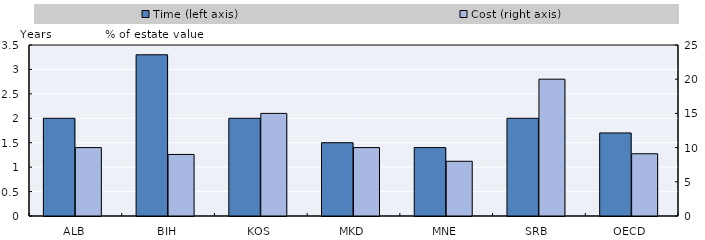
| Category | Time (left axis)  | Pad time |
|---|---|---|
| ALB | 2 |  |
| BIH | 3.3 |  |
| KOS | 2 |  |
| MKD | 1.5 |  |
| MNE | 1.4 |  |
| SRB | 2 |  |
| OECD | 1.7 |  |